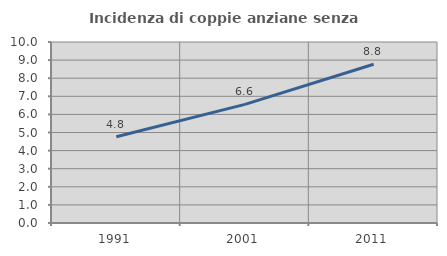
| Category | Incidenza di coppie anziane senza figli  |
|---|---|
| 1991.0 | 4.767 |
| 2001.0 | 6.556 |
| 2011.0 | 8.768 |